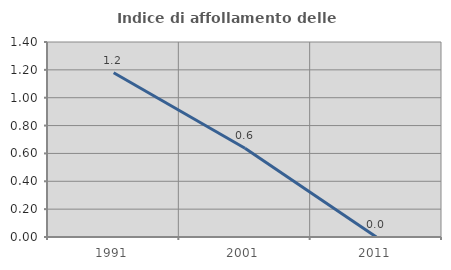
| Category | Indice di affollamento delle abitazioni  |
|---|---|
| 1991.0 | 1.179 |
| 2001.0 | 0.637 |
| 2011.0 | 0 |